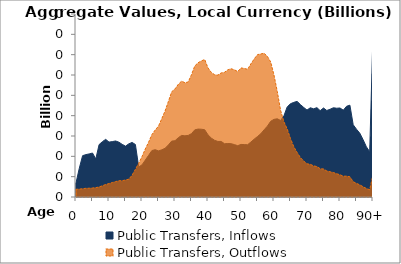
| Category | Public Transfers, Inflows | Public Transfers, Outflows |
|---|---|---|
| 0 | 3.461 | 1.885 |
|  | 7.076 | 1.952 |
| 2 | 10.16 | 2.026 |
| 3 | 10.426 | 2.142 |
| 4 | 10.596 | 2.154 |
| 5 | 10.814 | 2.221 |
| 6 | 9.362 | 2.294 |
| 7 | 12.891 | 2.471 |
| 8 | 13.612 | 2.761 |
| 9 | 14.179 | 3.076 |
| 10 | 13.503 | 3.303 |
| 11 | 13.623 | 3.563 |
| 12 | 13.778 | 3.785 |
| 13 | 13.485 | 3.999 |
| 14 | 12.943 | 4.005 |
| 15 | 12.503 | 4.183 |
| 16 | 13.07 | 4.384 |
| 17 | 13.422 | 5.354 |
| 18 | 12.909 | 6.792 |
| 19 | 7.393 | 8.29 |
| 20 | 7.901 | 9.935 |
| 21 | 9.074 | 11.816 |
| 22 | 10.247 | 13.48 |
| 23 | 11.417 | 15.344 |
| 24 | 11.637 | 16.466 |
| 25 | 11.334 | 17.425 |
| 26 | 11.607 | 19.287 |
| 27 | 11.981 | 21.161 |
| 28 | 12.804 | 23.504 |
| 29 | 13.751 | 25.872 |
| 30 | 13.836 | 26.569 |
| 31 | 14.578 | 27.708 |
| 32 | 15.146 | 28.494 |
| 33 | 15.052 | 28.095 |
| 34 | 15.144 | 28.283 |
| 35 | 15.59 | 30.087 |
| 36 | 16.507 | 32.229 |
| 37 | 16.704 | 33.019 |
| 38 | 16.664 | 33.462 |
| 39 | 16.541 | 33.813 |
| 40 | 15.287 | 31.744 |
| 41 | 14.487 | 30.64 |
| 42 | 13.942 | 30.068 |
| 43 | 13.661 | 29.975 |
| 44 | 13.665 | 30.508 |
| 45 | 13.101 | 30.667 |
| 46 | 13.15 | 31.273 |
| 47 | 13.11 | 31.534 |
| 48 | 12.885 | 31.28 |
| 49 | 12.619 | 30.847 |
| 50 | 12.927 | 31.729 |
| 51 | 12.889 | 31.615 |
| 52 | 12.856 | 31.395 |
| 53 | 13.516 | 32.747 |
| 54 | 14.227 | 33.95 |
| 55 | 14.873 | 35.014 |
| 56 | 15.566 | 35.177 |
| 57 | 16.518 | 35.342 |
| 58 | 17.429 | 34.571 |
| 59 | 18.62 | 33.209 |
| 60 | 19.092 | 29.959 |
| 61 | 19.231 | 25.935 |
| 62 | 18.818 | 21.303 |
| 63 | 19.945 | 18.496 |
| 64 | 22.148 | 16.732 |
| 65 | 22.937 | 14.361 |
| 66 | 23.269 | 12.357 |
| 67 | 23.514 | 10.965 |
| 68 | 22.732 | 9.691 |
| 69 | 22.027 | 8.838 |
| 70 | 21.382 | 8.164 |
| 71 | 21.945 | 8.034 |
| 72 | 21.69 | 7.657 |
| 73 | 21.976 | 7.483 |
| 74 | 21.233 | 6.959 |
| 75 | 21.887 | 6.889 |
| 76 | 21.273 | 6.401 |
| 77 | 21.58 | 6.2 |
| 78 | 21.944 | 6.022 |
| 79 | 21.826 | 5.707 |
| 80 | 21.886 | 5.472 |
| 81 | 21.349 | 5.109 |
| 82 | 22.313 | 5.126 |
| 83 | 22.58 | 4.974 |
| 84 | 17.77 | 3.748 |
| 85 | 16.665 | 3.351 |
| 86 | 15.685 | 2.984 |
| 87 | 14.097 | 2.528 |
| 88 | 12.338 | 2.091 |
| 89 | 11.14 | 1.785 |
| 90+ | 40.206 | 5.527 |